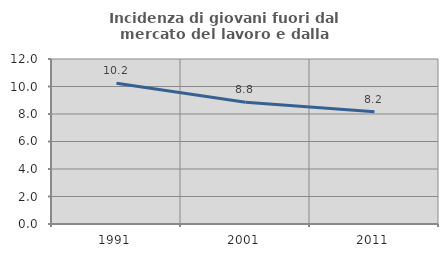
| Category | Incidenza di giovani fuori dal mercato del lavoro e dalla formazione  |
|---|---|
| 1991.0 | 10.236 |
| 2001.0 | 8.85 |
| 2011.0 | 8.163 |